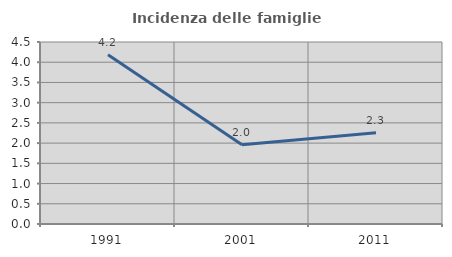
| Category | Incidenza delle famiglie numerose |
|---|---|
| 1991.0 | 4.184 |
| 2001.0 | 1.958 |
| 2011.0 | 2.254 |